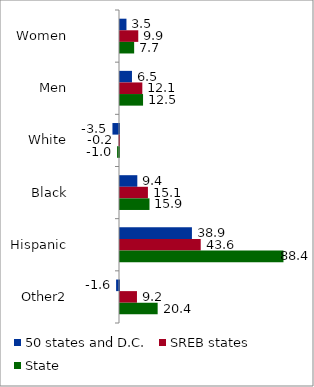
| Category | 50 states and D.C. | SREB states | State |
|---|---|---|---|
| Women | 3.491 | 9.876 | 7.654 |
| Men | 6.47 | 12.069 | 12.462 |
| White | -3.542 | -0.249 | -1.036 |
| Black | 9.357 | 15.095 | 15.938 |
| Hispanic | 38.881 | 43.632 | 88.36 |
| Other2 | -1.567 | 9.17 | 20.355 |